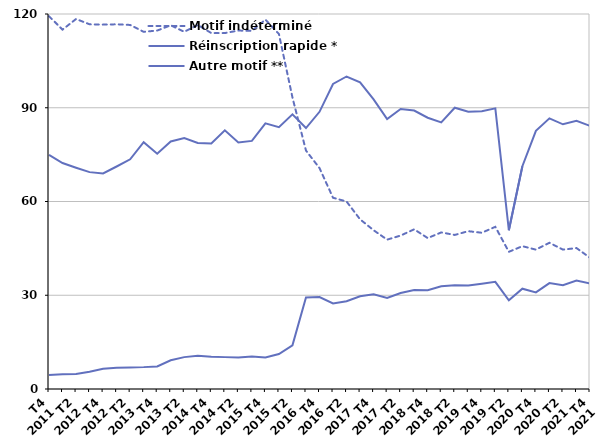
| Category | Motif indéterminé | Réinscription rapide * | Autre motif ** |
|---|---|---|---|
| T4
2011 | 119.3 | 74.9 | 4.5 |
| T1
2012 | 115 | 72.3 | 4.7 |
| T2
2012 | 118.4 | 70.8 | 4.8 |
| T3
2012 | 116.7 | 69.4 | 5.5 |
| T4
2012 | 116.6 | 69 | 6.5 |
| T1
2013 | 116.7 | 71.2 | 6.8 |
| T2
2013 | 116.5 | 73.5 | 6.9 |
| T3
2013 | 114.3 | 79 | 7 |
| T4
2013 | 114.7 | 75.3 | 7.2 |
| T1
2014 | 116.4 | 79.2 | 9.2 |
| T2
2014 | 114.3 | 80.3 | 10.2 |
| T3
2014 | 116.5 | 78.7 | 10.6 |
| T4
2014 | 113.9 | 78.6 | 10.3 |
| T1
2015 | 113.9 | 82.8 | 10.2 |
| T2
2015 | 114.7 | 78.9 | 10.1 |
| T3
2015 | 114.6 | 79.4 | 10.4 |
| T4
2015 | 118.2 | 85 | 10.1 |
| T1
2016 | 113.6 | 83.8 | 11.2 |
| T2
2016 | 93.3 | 87.9 | 14 |
| T3
2016 | 76.3 | 83.5 | 29.3 |
| T4
2016 | 70.7 | 88.7 | 29.4 |
| T1
2017 | 61.2 | 97.6 | 27.4 |
| T2
2017 | 60 | 100 | 28.1 |
| T3
2017 | 54.3 | 98.1 | 29.7 |
| T4
2017 | 50.8 | 92.7 | 30.3 |
| T1
2018 | 47.8 | 86.4 | 29.1 |
| T2
2018 | 49.1 | 89.6 | 30.7 |
| T3
2018 | 51.1 | 89.1 | 31.7 |
| T4
2018 | 48.3 | 86.8 | 31.6 |
| T1
2019 | 50.1 | 85.3 | 32.9 |
| T2
2019 | 49.3 | 90 | 33.2 |
| T3
2019 | 50.5 | 88.7 | 33.1 |
| T4
2019 | 50 | 88.9 | 33.7 |
| T1
2020 | 51.9 | 89.8 | 34.3 |
| T2
2020 | 43.9 | 50.8 | 28.4 |
| T3
2020 | 45.7 | 71.3 | 32.1 |
| T4
2020 | 44.6 | 82.6 | 30.9 |
| T1
2021 | 46.8 | 86.6 | 33.9 |
| T2
2021 | 44.6 | 84.7 | 33.2 |
| T3
2021 | 45.1 | 85.8 | 34.7 |
| T4
2021 | 42 | 84.2 | 33.8 |